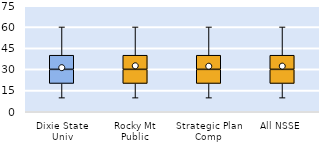
| Category | 25th | 50th | 75th |
|---|---|---|---|
| Dixie State Univ | 20 | 10 | 10 |
| Rocky Mt Public | 20 | 10 | 10 |
| Strategic Plan Comp | 20 | 10 | 10 |
| All NSSE | 20 | 10 | 10 |